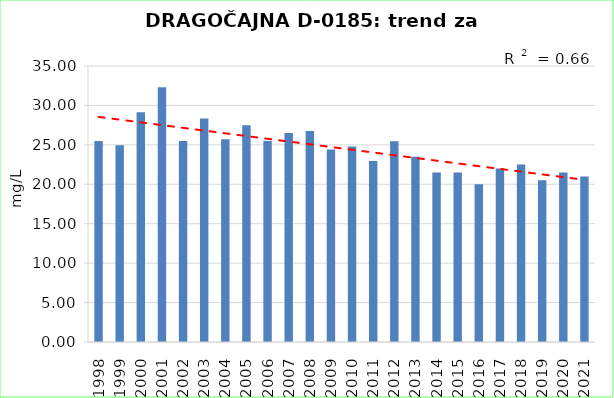
| Category | Vsota |
|---|---|
| 1998 | 25.5 |
| 1999 | 24.95 |
| 2000 | 29.15 |
| 2001 | 32.3 |
| 2002 | 25.5 |
| 2003 | 28.35 |
| 2004 | 25.7 |
| 2005 | 27.5 |
| 2006 | 25.5 |
| 2007 | 26.5 |
| 2008 | 26.75 |
| 2009 | 24.4 |
| 2010 | 24.8 |
| 2011 | 22.95 |
| 2012 | 25.45 |
| 2013 | 23.5 |
| 2014 | 21.5 |
| 2015 | 21.5 |
| 2016 | 20 |
| 2017 | 22 |
| 2018 | 22.5 |
| 2019 | 20.5 |
| 2020 | 21.5 |
| 2021 | 21 |